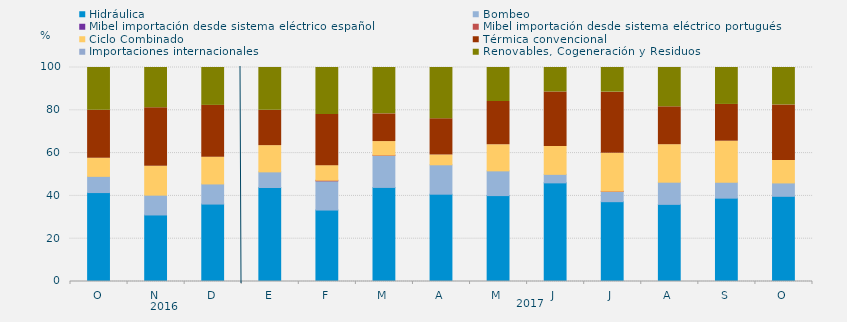
| Category | Hidráulica | Bombeo | Mibel importación desde sistema eléctrico español | Mibel importación desde sistema eléctrico portugués | Ciclo Combinado | Térmica convencional | Importaciones internacionales | Renovables, Cogeneración y Residuos |
|---|---|---|---|---|---|---|---|---|
| O | 41.555 | 7.572 | 0 | 0 | 8.468 | 22.469 | 0 | 19.937 |
| N | 31.088 | 9.259 | 0 | 0 | 13.495 | 27.361 | 0 | 18.796 |
| D | 36.178 | 9.409 | 0 | 0 | 12.522 | 24.194 | 0 | 17.697 |
| E | 43.929 | 7.303 | 0 | 0 | 12.254 | 16.51 | 0 | 20.004 |
| F | 33.383 | 13.641 | 0 | 0.298 | 6.82 | 23.884 | 0 | 21.974 |
| M | 43.966 | 14.984 | 0 | 0.135 | 6.303 | 12.943 | 0 | 21.669 |
| A | 40.799 | 13.738 | 0 | 0 | 4.583 | 16.933 | 0 | 23.947 |
| M | 40.143 | 11.559 | 0 | 0 | 12.186 | 20.228 | 0 | 15.883 |
| J | 46.088 | 3.981 | 0 | 0 | 13.032 | 25.463 | 0 | 11.435 |
| J | 37.298 | 4.783 | 0 | 0.134 | 17.675 | 28.595 | 0 | 11.514 |
| A | 36.044 | 10.361 | 0 | 0 | 17.518 | 17.708 | 0 | 18.369 |
| S | 38.947 | 7.407 | 0 | 0 | 19.201 | 17.187 | 0 | 17.257 |
| O | 39.807 | 6.25 | 0 | 0 | 10.484 | 25.963 | 0 | 17.496 |